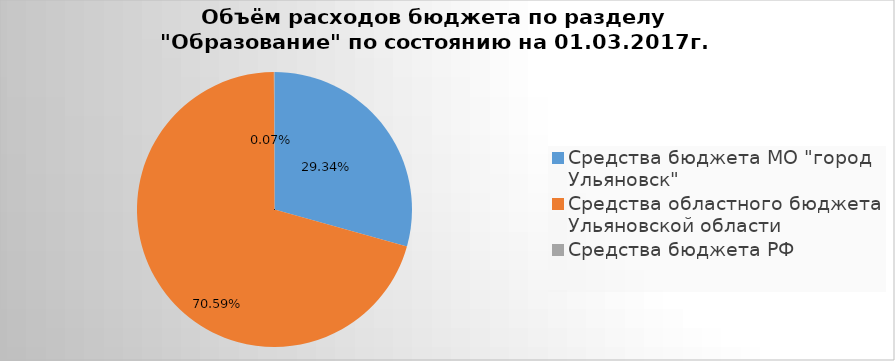
| Category | Series 0 |
|---|---|
| Средства бюджета МО "город Ульяновск" | 1517390.6 |
| Средства областного бюджета Ульяновской области | 3651223.21 |
| Средства бюджета РФ | 3773.5 |